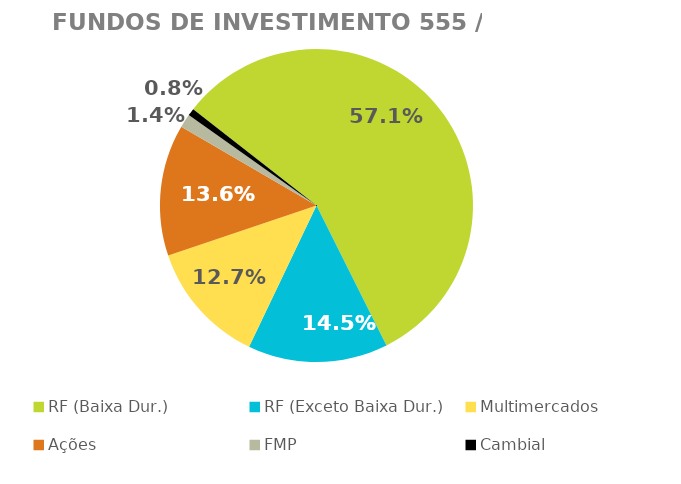
| Category | Fundos de Investimento 555 / FMP |
|---|---|
| RF (Baixa Dur.) | 0.571 |
| RF (Exceto Baixa Dur.) | 0.145 |
| Multimercados | 0.127 |
| Ações | 0.136 |
| FMP | 0.014 |
| Cambial | 0.008 |